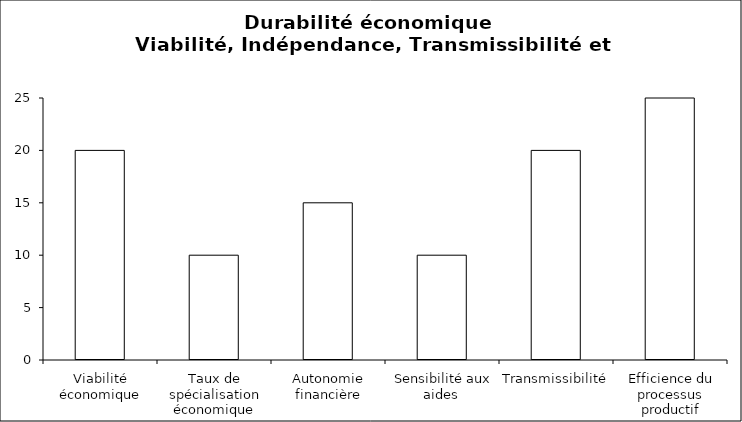
| Category | Valeur de l'exploitation agricole | Complément au maximum |
|---|---|---|
| Viabilité économique | 0 | 20 |
| Taux de spécialisation économique | 0 | 10 |
| Autonomie financière | 0 | 15 |
| Sensibilité aux aides  | 0 | 10 |
| Transmissibilité | 0 | 20 |
| Efficience du processus productif | 0 | 25 |